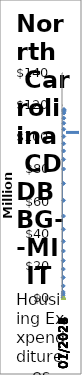
| Category | Projected Expenditures | Actual Expenditure |
|---|---|---|
| 07/2021 | 0 | 0 |
| 10/2021 | 0 | 0 |
| 01/2022 | 150000 | 0 |
| 04/2022 | 1350000 | 0 |
| 07/2022 | 2550000 | 0 |
| 10/2022 | 3750000 | 0 |
| 01/2023 | 7500000 | 0 |
| 04/2023 | 12750000 | 0 |
| 07/2023 | 18000000 | 0 |
| 10/2023 | 23250000 | 0 |
| 01/2024 | 29250000 | 0 |
| 04/2024 | 35250000 | 0 |
| 07/2024 | 42750000 | 0 |
| 10/2024 | 51000000 | 0 |
| 01/2025 | 60750000 | 0 |
| 04/2025 | 71250000 | 0 |
| 07/2025 | 80250000 | 0 |
| 10/2025 | 86250000 | 0 |
| 01/2026 | 91500000 | 0 |
| 04/2026 | 96000000 | 0 |
| 07/2026 | 100500000 | 0 |
| 10/2026 | 105000000 | 0 |
| 01/2027 | 108750000 | 0 |
| 04/2027 | 111900000 | 0 |
| 07/2027 | 115050000 | 0 |
| 10/2027 | 115950000 | 0 |
| 01/2028 | 116700000 | 0 |
| 04/2028 | 117000000 | 0 |
| 07/2028 | 117300000 | 0 |